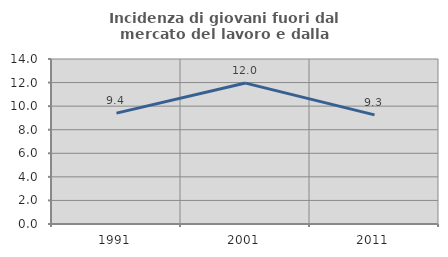
| Category | Incidenza di giovani fuori dal mercato del lavoro e dalla formazione  |
|---|---|
| 1991.0 | 9.408 |
| 2001.0 | 11.957 |
| 2011.0 | 9.259 |